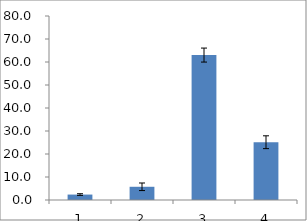
| Category | Series 0 |
|---|---|
| 0 | 2.363 |
| 1 | 5.747 |
| 2 | 63.012 |
| 3 | 25.125 |